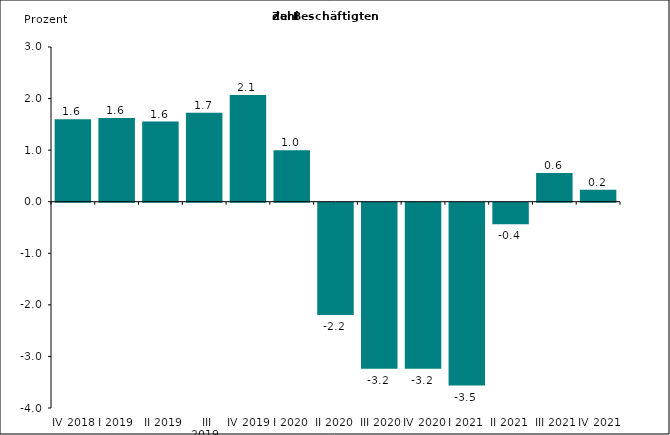
| Category | Series 0 |
|---|---|
| IV 2018 | 1.6 |
| I 2019 | 1.626 |
|  II 2019 | 1.554 |
|  III 2019 | 1.726 |
| IV 2019 | 2.07 |
| I 2020 | 1 |
| II 2020 | -2.176 |
| III 2020 | -3.218 |
| IV 2020 | -3.22 |
| I 2021 | -3.546 |
| II 2021 | -0.419 |
| III 2021 | 0.557 |
| IV 2021 | 0.23 |